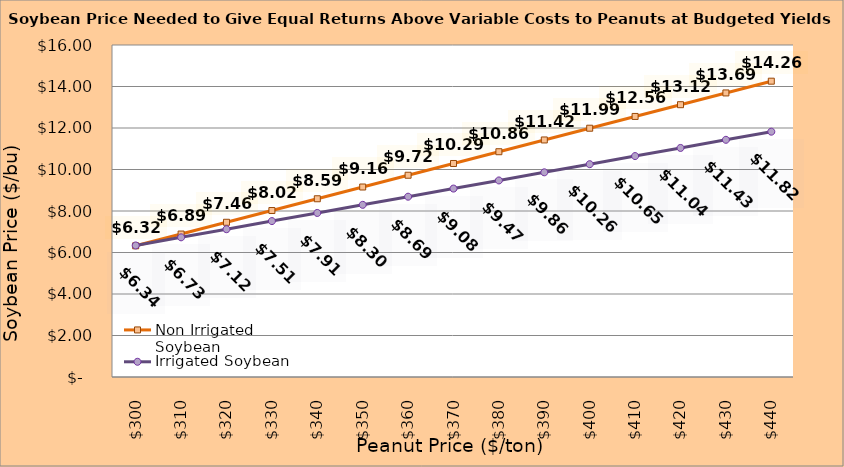
| Category | Non Irrigated Soybean | Irrigated Soybean |
|---|---|---|
| 299.8936170212766 | 6.323 | 6.339 |
| 309.8936170212766 | 6.89 | 6.731 |
| 319.8936170212766 | 7.457 | 7.122 |
| 329.8936170212766 | 8.023 | 7.514 |
| 339.8936170212766 | 8.59 | 7.906 |
| 349.8936170212766 | 9.157 | 8.297 |
| 359.8936170212766 | 9.723 | 8.689 |
| 369.8936170212766 | 10.29 | 9.081 |
| 379.8936170212766 | 10.857 | 9.472 |
| 389.8936170212766 | 11.423 | 9.864 |
| 399.8936170212766 | 11.99 | 10.256 |
| 409.8936170212766 | 12.557 | 10.647 |
| 419.8936170212766 | 13.123 | 11.039 |
| 429.8936170212766 | 13.69 | 11.431 |
| 439.8936170212766 | 14.257 | 11.822 |